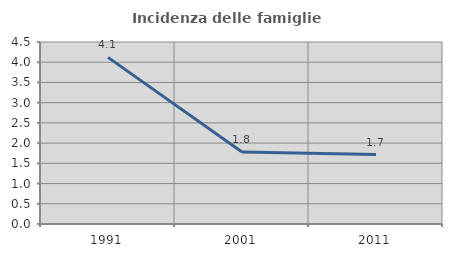
| Category | Incidenza delle famiglie numerose |
|---|---|
| 1991.0 | 4.12 |
| 2001.0 | 1.782 |
| 2011.0 | 1.716 |